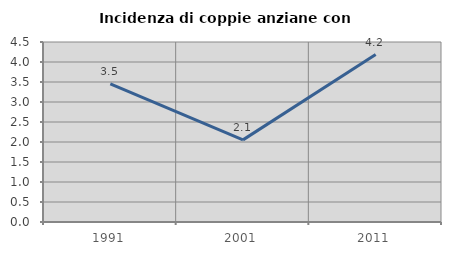
| Category | Incidenza di coppie anziane con figli |
|---|---|
| 1991.0 | 3.455 |
| 2001.0 | 2.053 |
| 2011.0 | 4.186 |